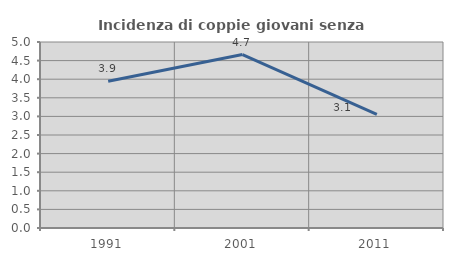
| Category | Incidenza di coppie giovani senza figli |
|---|---|
| 1991.0 | 3.947 |
| 2001.0 | 4.663 |
| 2011.0 | 3.056 |